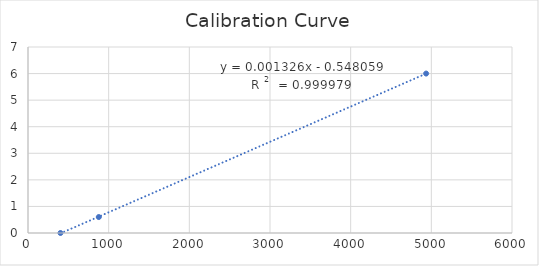
| Category | Series 0 |
|---|---|
| 4935.5 | 6 |
| 877.5 | 0.6 |
| 402.5 | 0 |